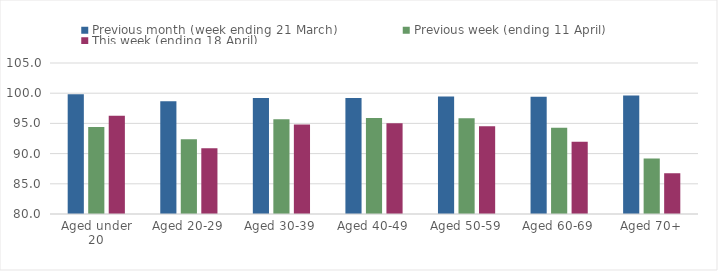
| Category | Previous month (week ending 21 March) | Previous week (ending 11 April) | This week (ending 18 April) |
|---|---|---|---|
| Aged under 20 | 99.826 | 94.405 | 96.258 |
| Aged 20-29 | 98.647 | 92.38 | 90.897 |
| Aged 30-39 | 99.187 | 95.697 | 94.83 |
| Aged 40-49 | 99.189 | 95.884 | 95.03 |
| Aged 50-59 | 99.464 | 95.843 | 94.538 |
| Aged 60-69 | 99.411 | 94.298 | 91.942 |
| Aged 70+ | 99.63 | 89.185 | 86.747 |